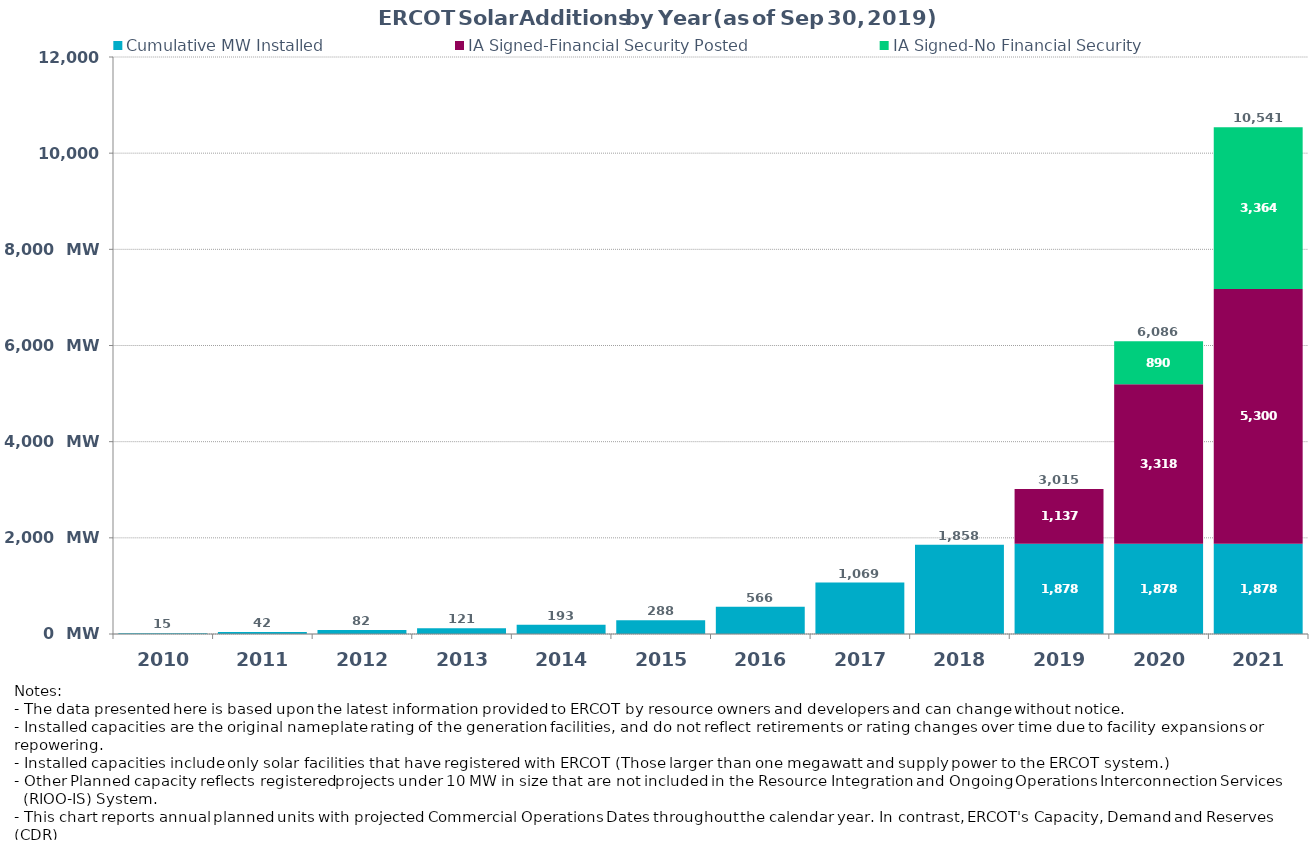
| Category | Cumulative MW Installed | IA Signed-Financial Security Posted  | IA Signed-No Financial Security  | Other Planned | Cumulative Installed and Planned |
|---|---|---|---|---|---|
| 2010.0 | 15 | 0 | 0 | 0 | 15 |
| 2011.0 | 42 | 0 | 0 | 0 | 42 |
| 2012.0 | 82 | 0 | 0 | 0 | 82 |
| 2013.0 | 121 | 0 | 0 | 0 | 121 |
| 2014.0 | 193 | 0 | 0 | 0 | 193 |
| 2015.0 | 287.7 | 0 | 0 | 0 | 287.7 |
| 2016.0 | 566.4 | 0 | 0 | 0 | 566.4 |
| 2017.0 | 1068.7 | 0 | 0 | 0 | 1068.7 |
| 2018.0 | 1857.7 | 0 | 0 | 0 | 1857.7 |
| 2019.0 | 1877.68 | 1137 | 0 | 0 | 3014.68 |
| 2020.0 | 1877.68 | 3317.91 | 890.45 | 0 | 6086.04 |
| 2021.0 | 1877.68 | 5299.6 | 3363.63 | 0 | 10540.91 |